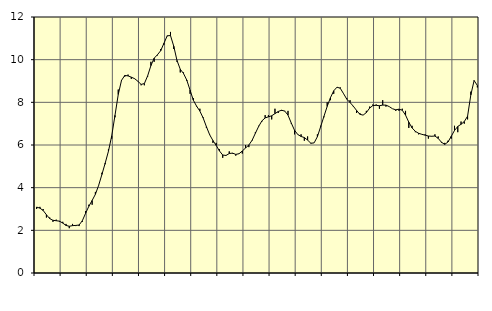
| Category | Piggar | Series 1 |
|---|---|---|
| nan | 3 | 3.09 |
| 87.0 | 3.1 | 3.04 |
| 87.0 | 3 | 2.93 |
| 87.0 | 2.6 | 2.73 |
| nan | 2.6 | 2.55 |
| 88.0 | 2.4 | 2.47 |
| 88.0 | 2.5 | 2.45 |
| 88.0 | 2.4 | 2.43 |
| nan | 2.4 | 2.34 |
| 89.0 | 2.3 | 2.23 |
| 89.0 | 2.1 | 2.19 |
| 89.0 | 2.3 | 2.22 |
| nan | 2.2 | 2.23 |
| 90.0 | 2.2 | 2.25 |
| 90.0 | 2.4 | 2.45 |
| 90.0 | 2.9 | 2.8 |
| nan | 3.2 | 3.13 |
| 91.0 | 3.2 | 3.4 |
| 91.0 | 3.8 | 3.69 |
| 91.0 | 4.1 | 4.11 |
| nan | 4.7 | 4.62 |
| 92.0 | 5.1 | 5.15 |
| 92.0 | 5.8 | 5.71 |
| 92.0 | 6.3 | 6.43 |
| nan | 7.3 | 7.39 |
| 93.0 | 8.6 | 8.37 |
| 93.0 | 9 | 9.03 |
| 93.0 | 9.2 | 9.26 |
| nan | 9.3 | 9.24 |
| 94.0 | 9.1 | 9.18 |
| 94.0 | 9.1 | 9.11 |
| 94.0 | 9 | 8.99 |
| nan | 8.8 | 8.84 |
| 95.0 | 8.8 | 8.88 |
| 95.0 | 9.2 | 9.24 |
| 95.0 | 9.9 | 9.72 |
| nan | 9.9 | 10.07 |
| 96.0 | 10.2 | 10.23 |
| 96.0 | 10.5 | 10.42 |
| 96.0 | 10.7 | 10.77 |
| nan | 11.1 | 11.12 |
| 97.0 | 11.3 | 11.13 |
| 97.0 | 10.5 | 10.63 |
| 97.0 | 9.9 | 9.96 |
| nan | 9.4 | 9.55 |
| 98.0 | 9.4 | 9.35 |
| 98.0 | 9 | 9.04 |
| 98.0 | 8.4 | 8.57 |
| nan | 8.2 | 8.1 |
| 99.0 | 7.8 | 7.82 |
| 99.0 | 7.7 | 7.59 |
| 99.0 | 7.3 | 7.27 |
| nan | 6.8 | 6.86 |
| 0.0 | 6.5 | 6.48 |
| 0.0 | 6.1 | 6.21 |
| 0.0 | 6.1 | 5.98 |
| nan | 5.8 | 5.72 |
| 1.0 | 5.4 | 5.53 |
| 1.0 | 5.5 | 5.51 |
| 1.0 | 5.7 | 5.6 |
| nan | 5.6 | 5.62 |
| 2.0 | 5.5 | 5.56 |
| 2.0 | 5.6 | 5.59 |
| 2.0 | 5.6 | 5.72 |
| nan | 6 | 5.86 |
| 3.0 | 5.9 | 6 |
| 3.0 | 6.2 | 6.22 |
| 3.0 | 6.6 | 6.55 |
| nan | 6.9 | 6.87 |
| 4.0 | 7.1 | 7.13 |
| 4.0 | 7.4 | 7.27 |
| 4.0 | 7.4 | 7.32 |
| nan | 7.2 | 7.37 |
| 5.0 | 7.7 | 7.47 |
| 5.0 | 7.5 | 7.57 |
| 5.0 | 7.6 | 7.63 |
| nan | 7.6 | 7.59 |
| 6.0 | 7.6 | 7.4 |
| 6.0 | 7 | 7.03 |
| 6.0 | 6.5 | 6.69 |
| nan | 6.5 | 6.49 |
| 7.0 | 6.5 | 6.4 |
| 7.0 | 6.2 | 6.35 |
| 7.0 | 6.4 | 6.23 |
| nan | 6.1 | 6.08 |
| 8.0 | 6.1 | 6.1 |
| 8.0 | 6.5 | 6.39 |
| 8.0 | 6.9 | 6.86 |
| nan | 7.3 | 7.34 |
| 9.0 | 8 | 7.81 |
| 9.0 | 8.1 | 8.22 |
| 9.0 | 8.4 | 8.54 |
| nan | 8.7 | 8.71 |
| 10.0 | 8.7 | 8.66 |
| 10.0 | 8.4 | 8.41 |
| 10.0 | 8.2 | 8.15 |
| nan | 8.1 | 7.99 |
| 11.0 | 7.8 | 7.82 |
| 11.0 | 7.5 | 7.62 |
| 11.0 | 7.5 | 7.44 |
| nan | 7.4 | 7.4 |
| 12.0 | 7.6 | 7.52 |
| 12.0 | 7.8 | 7.73 |
| 12.0 | 7.9 | 7.85 |
| nan | 7.9 | 7.86 |
| 13.0 | 7.7 | 7.84 |
| 13.0 | 8.1 | 7.87 |
| 13.0 | 7.8 | 7.87 |
| nan | 7.8 | 7.8 |
| 14.0 | 7.7 | 7.7 |
| 14.0 | 7.6 | 7.65 |
| 14.0 | 7.6 | 7.68 |
| nan | 7.7 | 7.63 |
| 15.0 | 7.6 | 7.4 |
| 15.0 | 6.8 | 7.07 |
| 15.0 | 6.9 | 6.8 |
| nan | 6.6 | 6.64 |
| 16.0 | 6.5 | 6.55 |
| 16.0 | 6.5 | 6.5 |
| 16.0 | 6.5 | 6.46 |
| nan | 6.3 | 6.42 |
| 17.0 | 6.4 | 6.41 |
| 17.0 | 6.5 | 6.42 |
| 17.0 | 6.4 | 6.31 |
| nan | 6.1 | 6.13 |
| 18.0 | 6.1 | 6.03 |
| 18.0 | 6.2 | 6.14 |
| 18.0 | 6.3 | 6.41 |
| nan | 6.9 | 6.68 |
| 19.0 | 6.6 | 6.87 |
| 19.0 | 7.1 | 6.97 |
| 19.0 | 7 | 7.1 |
| nan | 7.2 | 7.35 |
| 20.0 | 8.5 | 8.35 |
| 20.0 | 9 | 9.02 |
| 20.0 | 8.7 | 8.79 |